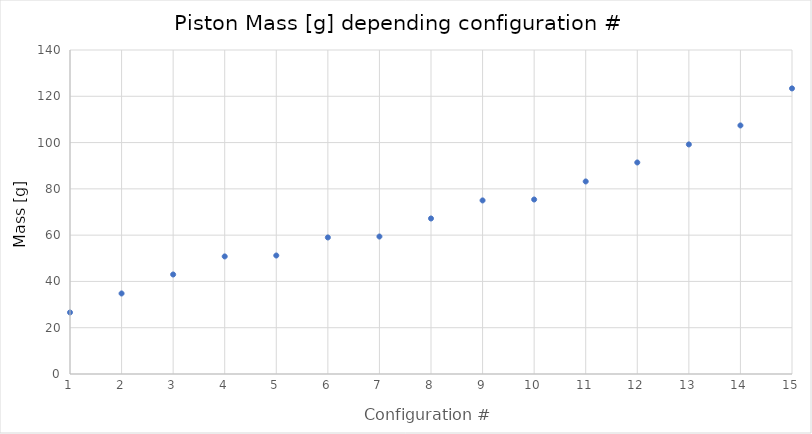
| Category | mass [g] |
|---|---|
| 1.0 | 26.6 |
| 2.0 | 34.8 |
| 3.0 | 43 |
| 4.0 | 50.8 |
| 5.0 | 51.2 |
| 6.0 | 59 |
| 7.0 | 59.4 |
| 8.0 | 67.2 |
| 9.0 | 75 |
| 10.0 | 75.4 |
| 11.0 | 83.2 |
| 12.0 | 91.4 |
| 13.0 | 99.2 |
| 14.0 | 107.4 |
| 15.0 | 123.4 |